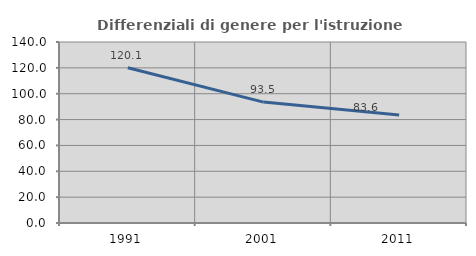
| Category | Differenziali di genere per l'istruzione superiore |
|---|---|
| 1991.0 | 120.058 |
| 2001.0 | 93.505 |
| 2011.0 | 83.584 |